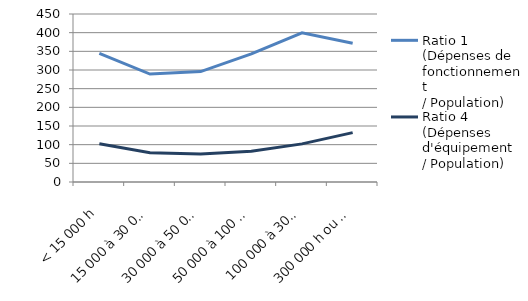
| Category | Ratio 1 
(Dépenses de fonctionnement 
/ Population) | Ratio 4 
(Dépenses d'équipement 
/ Population) |
|---|---|---|
| < 15 000 h | 344.664 | 102.285 |
| 15 000 à 30 000 h | 289.082 | 78.248 |
| 30 000 à 50 000 h | 295.711 | 75.046 |
| 50 000 à 100 000 h | 343.268 | 82.237 |
| 100 000 à 300 000 h | 399.372 | 102.116 |
| 300 000 h ou plus | 371.509 | 132.24 |